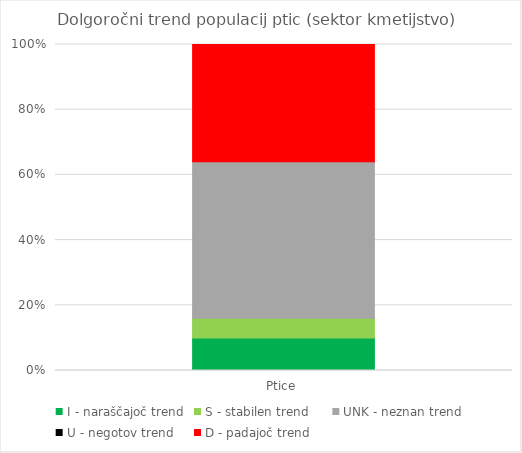
| Category | I - naraščajoč trend | S - stabilen trend | UNK - neznan trend | U - negotov trend | D - padajoč trend |
|---|---|---|---|---|---|
| Ptice | 5 | 3 | 24 | 0 | 18 |